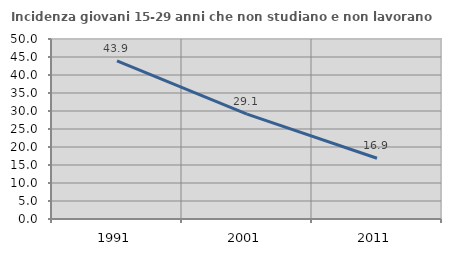
| Category | Incidenza giovani 15-29 anni che non studiano e non lavorano  |
|---|---|
| 1991.0 | 43.894 |
| 2001.0 | 29.146 |
| 2011.0 | 16.867 |